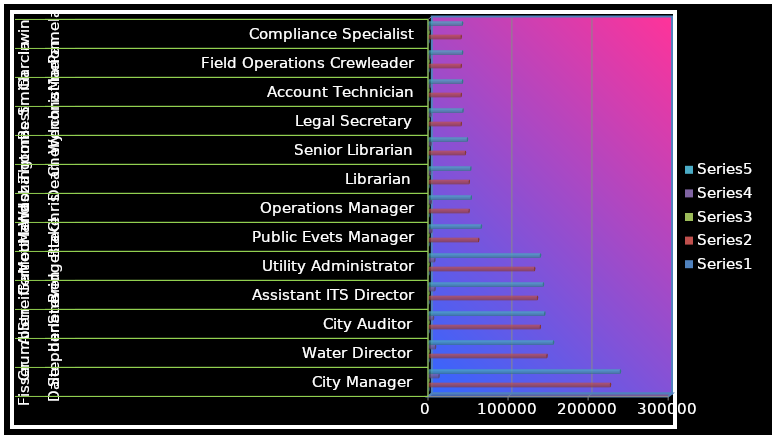
| Category | Series 0 | Series 1 | Series 2 | Series 3 | Series 4 |
|---|---|---|---|---|---|
| 0 | 23 | 226595 | 0.055 | 12462.725 | 239057.725 |
| 1 | 5 | 147347 | 0.055 | 8104.085 | 155451.085 |
| 2 | 3 | 139048 | 0.04 | 5561.92 | 144609.92 |
| 3 | 6 | 135429 | 0.055 | 7448.595 | 142877.595 |
| 4 | 16 | 131934 | 0.055 | 7256.37 | 139190.37 |
| 5 | 12 | 62008 | 0.055 | 3410.44 | 65418.44 |
| 6 | 11 | 50107 | 0.055 | 2755.885 | 52862.885 |
| 7 | 4 | 50232 | 0.04 | 2009.28 | 52241.28 |
| 8 | 17 | 45448 | 0.055 | 2499.64 | 47947.64 |
| 9 | 10 | 40290 | 0.055 | 2215.95 | 42505.95 |
| 10 | 3 | 40290 | 0.04 | 1611.6 | 41901.6 |
| 11 | 1 | 40269 | 0.04 | 1610.76 | 41879.76 |
| 12 | 4 | 40165 | 0.04 | 1606.6 | 41771.6 |